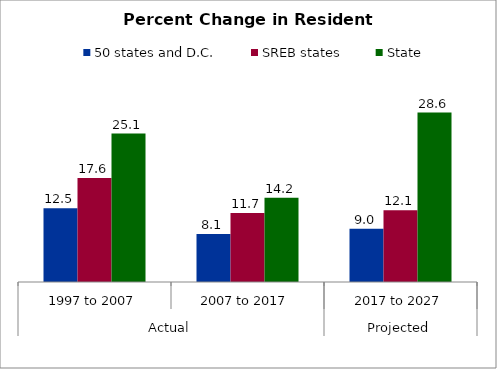
| Category | 50 states and D.C. | SREB states | State |
|---|---|---|---|
| 0 | 12.491 | 17.583 | 25.093 |
| 1 | 8.129 | 11.67 | 14.245 |
| 2 | 9 | 12.149 | 28.647 |